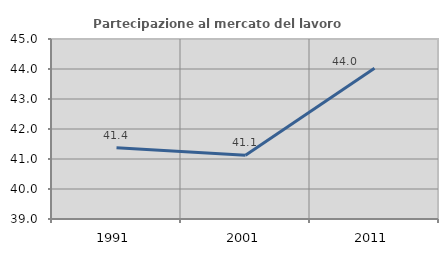
| Category | Partecipazione al mercato del lavoro  femminile |
|---|---|
| 1991.0 | 41.378 |
| 2001.0 | 41.128 |
| 2011.0 | 44.021 |